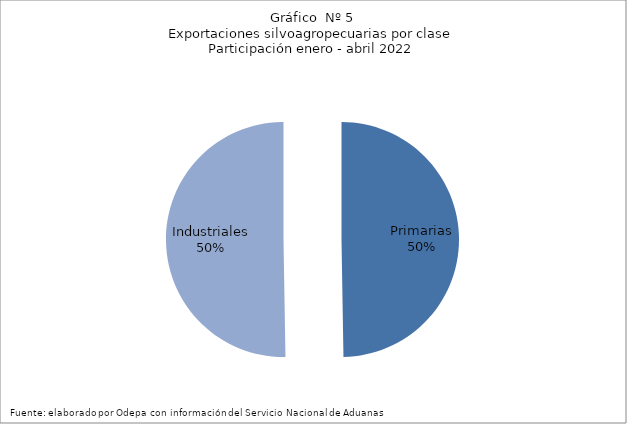
| Category | Series 0 |
|---|---|
| Primarias | 3557289 |
| Industriales | 3595653 |